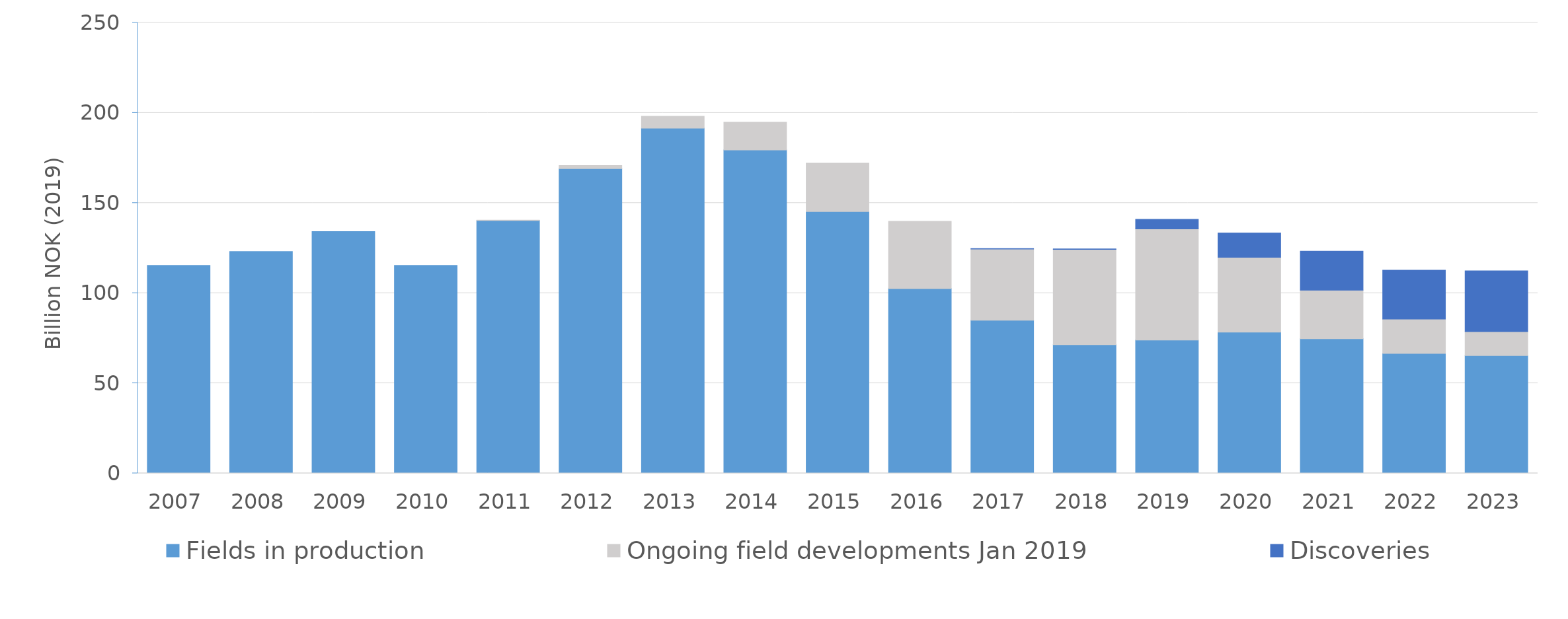
| Category | Fields in production | Ongoing field developments Jan 2019 | Discoveries |
|---|---|---|---|
| 2007.0 | 115.397 | 0 | 0 |
| 2008.0 | 123.11 | 0 | 0 |
| 2009.0 | 134.206 | 0 | 0 |
| 2010.0 | 115.379 | 0 | 0 |
| 2011.0 | 140.259 | 0.242 | 0 |
| 2012.0 | 169.108 | 1.713 | 0 |
| 2013.0 | 191.55 | 6.58 | 0 |
| 2014.0 | 179.449 | 15.407 | 0 |
| 2015.0 | 145.279 | 26.849 | 0 |
| 2016.0 | 102.583 | 37.263 | 0 |
| 2017.0 | 84.998 | 39.492 | 0.193 |
| 2018.0 | 71.388 | 52.91 | 0.234 |
| 2019.0 | 73.996 | 61.62 | 5.335 |
| 2020.0 | 78.322 | 41.585 | 13.401 |
| 2021.0 | 74.718 | 26.881 | 21.638 |
| 2022.0 | 66.541 | 19.047 | 27.088 |
| 2023.0 | 65.382 | 13.241 | 33.772 |